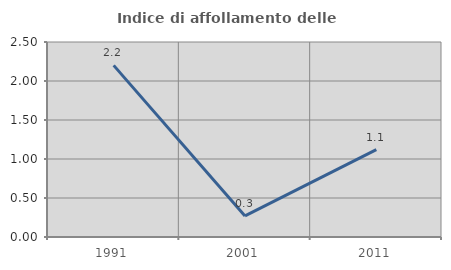
| Category | Indice di affollamento delle abitazioni  |
|---|---|
| 1991.0 | 2.2 |
| 2001.0 | 0.27 |
| 2011.0 | 1.12 |